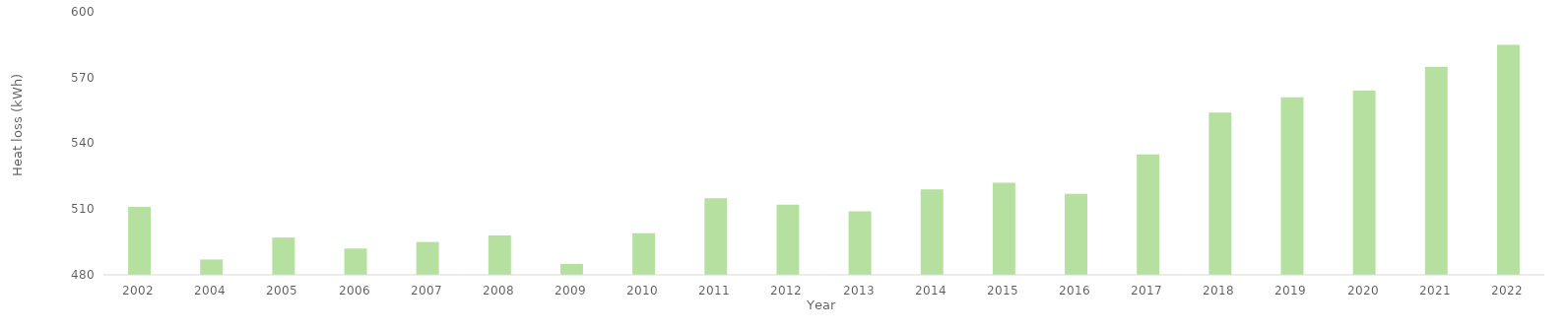
| Category | Series 0 |
|---|---|
| 2002.0 | 511 |
| 2004.0 | 487 |
| 2005.0 | 497 |
| 2006.0 | 492 |
| 2007.0 | 495 |
| 2008.0 | 498 |
| 2009.0 | 485 |
| 2010.0 | 499 |
| 2011.0 | 515 |
| 2012.0 | 512 |
| 2013.0 | 509 |
| 2014.0 | 519 |
| 2015.0 | 522 |
| 2016.0 | 517 |
| 2017.0 | 535 |
| 2018.0 | 554 |
| 2019.0 | 561 |
| 2020.0 | 564 |
| 2021.0 | 575 |
| 2022.0 | 585 |